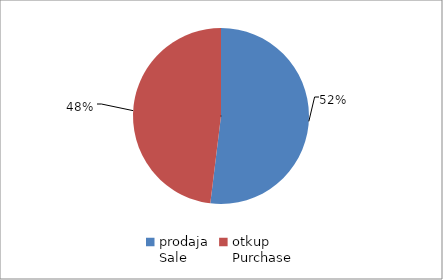
| Category | Series 0 |
|---|---|
| prodaja
Sale | 123578864.241 |
| otkup
Purchase | 114352127.36 |